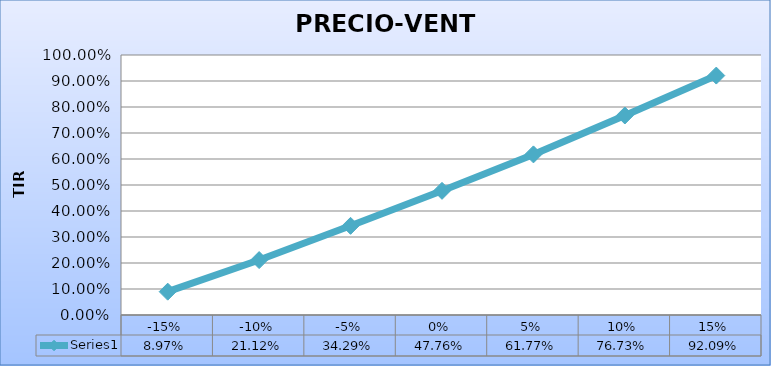
| Category | Series 0 |
|---|---|
| -0.15 | 0.09 |
| -0.1 | 0.211 |
| -0.05 | 0.343 |
| 0.0 | 0.478 |
| 0.05 | 0.618 |
| 0.1 | 0.767 |
| 0.15 | 0.921 |